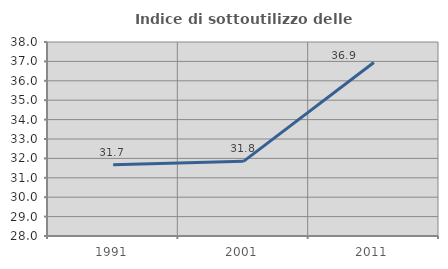
| Category | Indice di sottoutilizzo delle abitazioni  |
|---|---|
| 1991.0 | 31.677 |
| 2001.0 | 31.847 |
| 2011.0 | 36.943 |